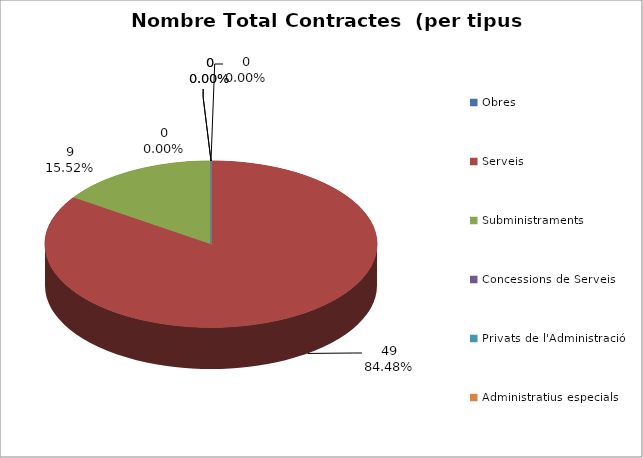
| Category | Nombre Total Contractes |
|---|---|
| Obres | 0 |
| Serveis | 49 |
| Subministraments | 9 |
| Concessions de Serveis | 0 |
| Privats de l'Administració | 0 |
| Administratius especials | 0 |